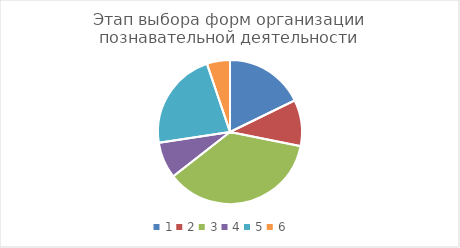
| Category | Series 0 |
|---|---|
| 0 | 0.192 |
| 1 | 0.112 |
| 2 | 0.392 |
| 3 | 0.088 |
| 4 | 0.24 |
| 5 | 0.056 |